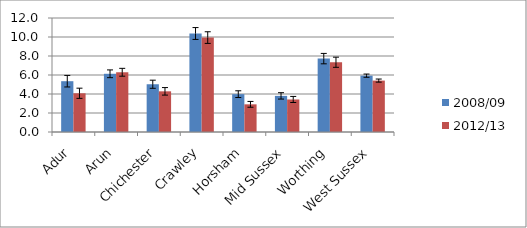
| Category | 2008/09 | 2012/13 |
|---|---|---|
| Adur | 5.348 | 4.076 |
| Arun | 6.128 | 6.288 |
| Chichester | 5.027 | 4.281 |
| Crawley | 10.369 | 9.939 |
| Horsham | 3.984 | 2.912 |
| Mid Sussex | 3.802 | 3.424 |
| Worthing | 7.724 | 7.343 |
| West Sussex | 5.93 | 5.412 |